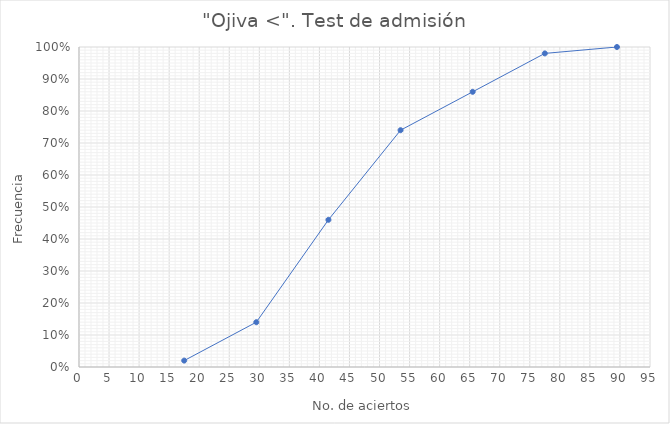
| Category | Series 0 |
|---|---|
| 17.5 | 0.02 |
| 29.5 | 0.14 |
| 41.5 | 0.46 |
| 53.5 | 0.74 |
| 65.5 | 0.86 |
| 77.5 | 0.98 |
| 89.5 | 1 |